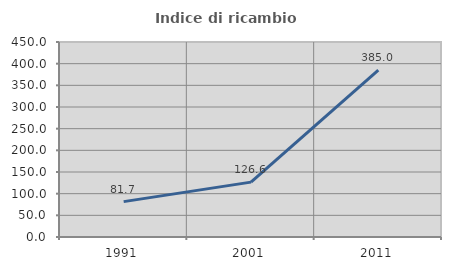
| Category | Indice di ricambio occupazionale  |
|---|---|
| 1991.0 | 81.671 |
| 2001.0 | 126.606 |
| 2011.0 | 385 |